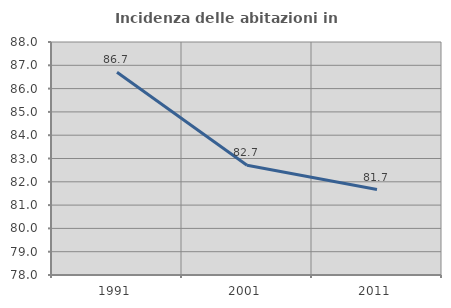
| Category | Incidenza delle abitazioni in proprietà  |
|---|---|
| 1991.0 | 86.705 |
| 2001.0 | 82.71 |
| 2011.0 | 81.667 |